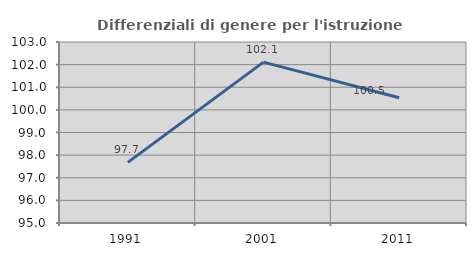
| Category | Differenziali di genere per l'istruzione superiore |
|---|---|
| 1991.0 | 97.681 |
| 2001.0 | 102.112 |
| 2011.0 | 100.537 |